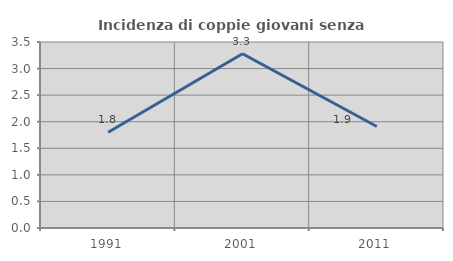
| Category | Incidenza di coppie giovani senza figli |
|---|---|
| 1991.0 | 1.802 |
| 2001.0 | 3.279 |
| 2011.0 | 1.911 |